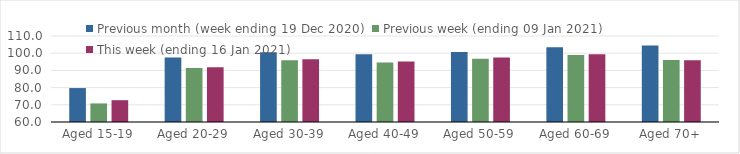
| Category | Previous month (week ending 19 Dec 2020) | Previous week (ending 09 Jan 2021) | This week (ending 16 Jan 2021) |
|---|---|---|---|
| Aged 15-19 | 79.73 | 70.8 | 72.68 |
| Aged 20-29 | 97.53 | 91.39 | 91.8 |
| Aged 30-39 | 100.62 | 95.87 | 96.46 |
| Aged 40-49 | 99.36 | 94.61 | 95.24 |
| Aged 50-59 | 100.76 | 96.75 | 97.56 |
| Aged 60-69 | 103.46 | 98.92 | 99.41 |
| Aged 70+ | 104.49 | 96.03 | 95.86 |